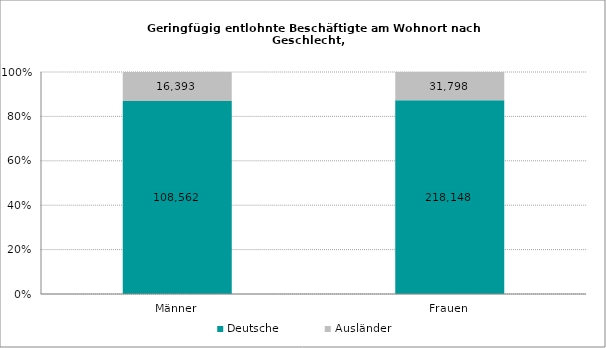
| Category | Deutsche | Ausländer |
|---|---|---|
| Männer | 108562 | 16393 |
| Frauen | 218148 | 31798 |